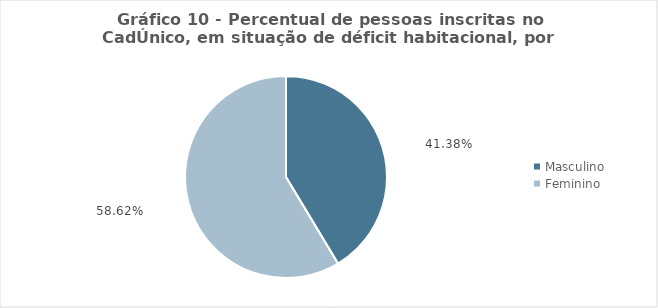
| Category | Series 0 |
|---|---|
| Masculino | 0.414 |
| Feminino | 0.586 |